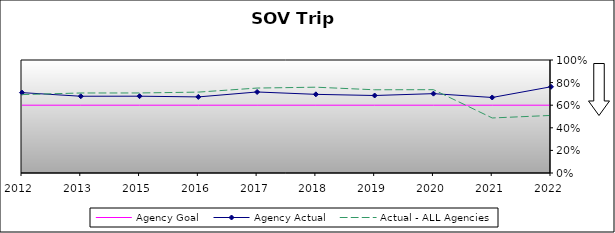
| Category | Agency Goal | Agency Actual | Actual - ALL Agencies |
|---|---|---|---|
| 2012.0 | 0.6 | 0.711 | 0.694 |
| 2013.0 | 0.6 | 0.679 | 0.708 |
| 2015.0 | 0.6 | 0.68 | 0.708 |
| 2016.0 | 0.6 | 0.673 | 0.716 |
| 2017.0 | 0.6 | 0.717 | 0.752 |
| 2018.0 | 0.6 | 0.696 | 0.759 |
| 2019.0 | 0.6 | 0.686 | 0.736 |
| 2020.0 | 0.6 | 0.702 | 0.737 |
| 2021.0 | 0.6 | 0.668 | 0.487 |
| 2022.0 | 0.6 | 0.763 | 0.509 |